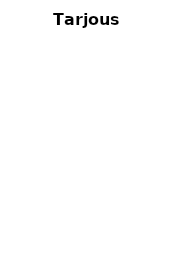
| Category | Tarjous 5 |
|---|---|
| HANKINTAKUSTANNUS KAPPALETTA KOHDEN | 0 |
| KÄYTTÖKUSTANNUSTEN NYKYARVO  | 0 |
| HUOLTOKUSTANNUSTEN NYKYARVO | 0 |
| MUUT KULUT YHTEENSÄ KAPPALETTA KOHDEN, NYKYARVO | 0 |